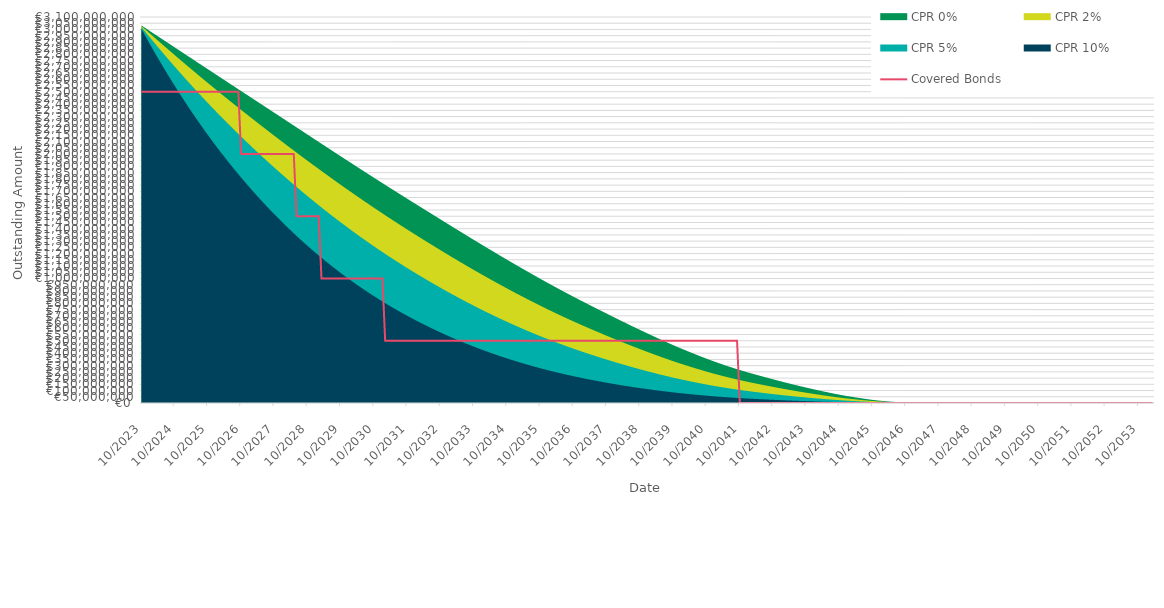
| Category | Covered Bonds |
|---|---|
| 2023-10-31 | 2500000000 |
| 2023-11-30 | 2500000000 |
| 2023-12-31 | 2500000000 |
| 2024-01-31 | 2500000000 |
| 2024-02-29 | 2500000000 |
| 2024-03-31 | 2500000000 |
| 2024-04-30 | 2500000000 |
| 2024-05-31 | 2500000000 |
| 2024-06-30 | 2500000000 |
| 2024-07-31 | 2500000000 |
| 2024-08-31 | 2500000000 |
| 2024-09-30 | 2500000000 |
| 2024-10-31 | 2500000000 |
| 2024-11-30 | 2500000000 |
| 2024-12-31 | 2500000000 |
| 2025-01-31 | 2500000000 |
| 2025-02-28 | 2500000000 |
| 2025-03-31 | 2500000000 |
| 2025-04-30 | 2500000000 |
| 2025-05-31 | 2500000000 |
| 2025-06-30 | 2500000000 |
| 2025-07-31 | 2500000000 |
| 2025-08-31 | 2500000000 |
| 2025-09-30 | 2500000000 |
| 2025-10-31 | 2500000000 |
| 2025-11-30 | 2500000000 |
| 2025-12-31 | 2500000000 |
| 2026-01-31 | 2500000000 |
| 2026-02-28 | 2500000000 |
| 2026-03-31 | 2500000000 |
| 2026-04-30 | 2500000000 |
| 2026-05-31 | 2500000000 |
| 2026-06-30 | 2500000000 |
| 2026-07-31 | 2500000000 |
| 2026-08-31 | 2500000000 |
| 2026-09-30 | 2500000000 |
| 2026-10-31 | 2000000000 |
| 2026-11-30 | 2000000000 |
| 2026-12-31 | 2000000000 |
| 2027-01-31 | 2000000000 |
| 2027-02-28 | 2000000000 |
| 2027-03-31 | 2000000000 |
| 2027-04-30 | 2000000000 |
| 2027-05-31 | 2000000000 |
| 2027-06-30 | 2000000000 |
| 2027-07-31 | 2000000000 |
| 2027-08-31 | 2000000000 |
| 2027-09-30 | 2000000000 |
| 2027-10-31 | 2000000000 |
| 2027-11-30 | 2000000000 |
| 2027-12-31 | 2000000000 |
| 2028-01-31 | 2000000000 |
| 2028-02-29 | 2000000000 |
| 2028-03-31 | 2000000000 |
| 2028-04-30 | 2000000000 |
| 2028-05-31 | 2000000000 |
| 2028-06-30 | 1500000000 |
| 2028-07-31 | 1500000000 |
| 2028-08-31 | 1500000000 |
| 2028-09-30 | 1500000000 |
| 2028-10-31 | 1500000000 |
| 2028-11-30 | 1500000000 |
| 2028-12-31 | 1500000000 |
| 2029-01-31 | 1500000000 |
| 2029-02-28 | 1500000000 |
| 2029-03-31 | 1000000000 |
| 2029-04-30 | 1000000000 |
| 2029-05-31 | 1000000000 |
| 2029-06-30 | 1000000000 |
| 2029-07-31 | 1000000000 |
| 2029-08-31 | 1000000000 |
| 2029-09-30 | 1000000000 |
| 2029-10-31 | 1000000000 |
| 2029-11-30 | 1000000000 |
| 2029-12-31 | 1000000000 |
| 2030-01-31 | 1000000000 |
| 2030-02-28 | 1000000000 |
| 2030-03-31 | 1000000000 |
| 2030-04-30 | 1000000000 |
| 2030-05-31 | 1000000000 |
| 2030-06-30 | 1000000000 |
| 2030-07-31 | 1000000000 |
| 2030-08-31 | 1000000000 |
| 2030-09-30 | 1000000000 |
| 2030-10-31 | 1000000000 |
| 2030-11-30 | 1000000000 |
| 2030-12-31 | 1000000000 |
| 2031-01-31 | 1000000000 |
| 2031-02-28 | 500000000 |
| 2031-03-31 | 500000000 |
| 2031-04-30 | 500000000 |
| 2031-05-31 | 500000000 |
| 2031-06-30 | 500000000 |
| 2031-07-31 | 500000000 |
| 2031-08-31 | 500000000 |
| 2031-09-30 | 500000000 |
| 2031-10-31 | 500000000 |
| 2031-11-30 | 500000000 |
| 2031-12-31 | 500000000 |
| 2032-01-31 | 500000000 |
| 2032-02-29 | 500000000 |
| 2032-03-31 | 500000000 |
| 2032-04-30 | 500000000 |
| 2032-05-31 | 500000000 |
| 2032-06-30 | 500000000 |
| 2032-07-31 | 500000000 |
| 2032-08-31 | 500000000 |
| 2032-09-30 | 500000000 |
| 2032-10-31 | 500000000 |
| 2032-11-30 | 500000000 |
| 2032-12-31 | 500000000 |
| 2033-01-31 | 500000000 |
| 2033-02-28 | 500000000 |
| 2033-03-31 | 500000000 |
| 2033-04-30 | 500000000 |
| 2033-05-31 | 500000000 |
| 2033-06-30 | 500000000 |
| 2033-07-31 | 500000000 |
| 2033-08-31 | 500000000 |
| 2033-09-30 | 500000000 |
| 2033-10-31 | 500000000 |
| 2033-11-30 | 500000000 |
| 2033-12-31 | 500000000 |
| 2034-01-31 | 500000000 |
| 2034-02-28 | 500000000 |
| 2034-03-31 | 500000000 |
| 2034-04-30 | 500000000 |
| 2034-05-31 | 500000000 |
| 2034-06-30 | 500000000 |
| 2034-07-31 | 500000000 |
| 2034-08-31 | 500000000 |
| 2034-09-30 | 500000000 |
| 2034-10-31 | 500000000 |
| 2034-11-30 | 500000000 |
| 2034-12-31 | 500000000 |
| 2035-01-31 | 500000000 |
| 2035-02-28 | 500000000 |
| 2035-03-31 | 500000000 |
| 2035-04-30 | 500000000 |
| 2035-05-31 | 500000000 |
| 2035-06-30 | 500000000 |
| 2035-07-31 | 500000000 |
| 2035-08-31 | 500000000 |
| 2035-09-30 | 500000000 |
| 2035-10-31 | 500000000 |
| 2035-11-30 | 500000000 |
| 2035-12-31 | 500000000 |
| 2036-01-31 | 500000000 |
| 2036-02-29 | 500000000 |
| 2036-03-31 | 500000000 |
| 2036-04-30 | 500000000 |
| 2036-05-31 | 500000000 |
| 2036-06-30 | 500000000 |
| 2036-07-31 | 500000000 |
| 2036-08-31 | 500000000 |
| 2036-09-30 | 500000000 |
| 2036-10-31 | 500000000 |
| 2036-11-30 | 500000000 |
| 2036-12-31 | 500000000 |
| 2037-01-31 | 500000000 |
| 2037-02-28 | 500000000 |
| 2037-03-31 | 500000000 |
| 2037-04-30 | 500000000 |
| 2037-05-31 | 500000000 |
| 2037-06-30 | 500000000 |
| 2037-07-31 | 500000000 |
| 2037-08-31 | 500000000 |
| 2037-09-30 | 500000000 |
| 2037-10-31 | 500000000 |
| 2037-11-30 | 500000000 |
| 2037-12-31 | 500000000 |
| 2038-01-31 | 500000000 |
| 2038-02-28 | 500000000 |
| 2038-03-31 | 500000000 |
| 2038-04-30 | 500000000 |
| 2038-05-31 | 500000000 |
| 2038-06-30 | 500000000 |
| 2038-07-31 | 500000000 |
| 2038-08-31 | 500000000 |
| 2038-09-30 | 500000000 |
| 2038-10-31 | 500000000 |
| 2038-11-30 | 500000000 |
| 2038-12-31 | 500000000 |
| 2039-01-31 | 500000000 |
| 2039-02-28 | 500000000 |
| 2039-03-31 | 500000000 |
| 2039-04-30 | 500000000 |
| 2039-05-31 | 500000000 |
| 2039-06-30 | 500000000 |
| 2039-07-31 | 500000000 |
| 2039-08-31 | 500000000 |
| 2039-09-30 | 500000000 |
| 2039-10-31 | 500000000 |
| 2039-11-30 | 500000000 |
| 2039-12-31 | 500000000 |
| 2040-01-31 | 500000000 |
| 2040-02-29 | 500000000 |
| 2040-03-31 | 500000000 |
| 2040-04-30 | 500000000 |
| 2040-05-31 | 500000000 |
| 2040-06-30 | 500000000 |
| 2040-07-31 | 500000000 |
| 2040-08-31 | 500000000 |
| 2040-09-30 | 500000000 |
| 2040-10-31 | 500000000 |
| 2040-11-30 | 500000000 |
| 2040-12-31 | 500000000 |
| 2041-01-31 | 500000000 |
| 2041-02-28 | 500000000 |
| 2041-03-31 | 500000000 |
| 2041-04-30 | 500000000 |
| 2041-05-31 | 500000000 |
| 2041-06-30 | 500000000 |
| 2041-07-31 | 500000000 |
| 2041-08-31 | 500000000 |
| 2041-09-30 | 500000000 |
| 2041-10-31 | 0 |
| 2041-11-30 | 0 |
| 2041-12-31 | 0 |
| 2042-01-31 | 0 |
| 2042-02-28 | 0 |
| 2042-03-31 | 0 |
| 2042-04-30 | 0 |
| 2042-05-31 | 0 |
| 2042-06-30 | 0 |
| 2042-07-31 | 0 |
| 2042-08-31 | 0 |
| 2042-09-30 | 0 |
| 2042-10-31 | 0 |
| 2042-11-30 | 0 |
| 2042-12-31 | 0 |
| 2043-01-31 | 0 |
| 2043-02-28 | 0 |
| 2043-03-31 | 0 |
| 2043-04-30 | 0 |
| 2043-05-31 | 0 |
| 2043-06-30 | 0 |
| 2043-07-31 | 0 |
| 2043-08-31 | 0 |
| 2043-09-30 | 0 |
| 2043-10-31 | 0 |
| 2043-11-30 | 0 |
| 2043-12-31 | 0 |
| 2044-01-31 | 0 |
| 2044-02-29 | 0 |
| 2044-03-31 | 0 |
| 2044-04-30 | 0 |
| 2044-05-31 | 0 |
| 2044-06-30 | 0 |
| 2044-07-31 | 0 |
| 2044-08-31 | 0 |
| 2044-09-30 | 0 |
| 2044-10-31 | 0 |
| 2044-11-30 | 0 |
| 2044-12-31 | 0 |
| 2045-01-31 | 0 |
| 2045-02-28 | 0 |
| 2045-03-31 | 0 |
| 2045-04-30 | 0 |
| 2045-05-31 | 0 |
| 2045-06-30 | 0 |
| 2045-07-31 | 0 |
| 2045-08-31 | 0 |
| 2045-09-30 | 0 |
| 2045-10-31 | 0 |
| 2045-11-30 | 0 |
| 2045-12-31 | 0 |
| 2046-01-31 | 0 |
| 2046-02-28 | 0 |
| 2046-03-31 | 0 |
| 2046-04-30 | 0 |
| 2046-05-31 | 0 |
| 2046-06-30 | 0 |
| 2046-07-31 | 0 |
| 2046-08-31 | 0 |
| 2046-09-30 | 0 |
| 2046-10-31 | 0 |
| 2046-11-30 | 0 |
| 2046-12-31 | 0 |
| 2047-01-31 | 0 |
| 2047-02-28 | 0 |
| 2047-03-31 | 0 |
| 2047-04-30 | 0 |
| 2047-05-31 | 0 |
| 2047-06-30 | 0 |
| 2047-07-31 | 0 |
| 2047-08-31 | 0 |
| 2047-09-30 | 0 |
| 2047-10-31 | 0 |
| 2047-11-30 | 0 |
| 2047-12-31 | 0 |
| 2048-01-31 | 0 |
| 2048-02-29 | 0 |
| 2048-03-31 | 0 |
| 2048-04-30 | 0 |
| 2048-05-31 | 0 |
| 2048-06-30 | 0 |
| 2048-07-31 | 0 |
| 2048-08-31 | 0 |
| 2048-09-30 | 0 |
| 2048-10-31 | 0 |
| 2048-11-30 | 0 |
| 2048-12-31 | 0 |
| 2049-01-31 | 0 |
| 2049-02-28 | 0 |
| 2049-03-31 | 0 |
| 2049-04-30 | 0 |
| 2049-05-31 | 0 |
| 2049-06-30 | 0 |
| 2049-07-31 | 0 |
| 2049-08-31 | 0 |
| 2049-09-30 | 0 |
| 2049-10-31 | 0 |
| 2049-11-30 | 0 |
| 2049-12-31 | 0 |
| 2050-01-31 | 0 |
| 2050-02-28 | 0 |
| 2050-03-31 | 0 |
| 2050-04-30 | 0 |
| 2050-05-31 | 0 |
| 2050-06-30 | 0 |
| 2050-07-31 | 0 |
| 2050-08-31 | 0 |
| 2050-09-30 | 0 |
| 2050-10-31 | 0 |
| 2050-11-30 | 0 |
| 2050-12-31 | 0 |
| 2051-01-31 | 0 |
| 2051-02-28 | 0 |
| 2051-03-31 | 0 |
| 2051-04-30 | 0 |
| 2051-05-31 | 0 |
| 2051-06-30 | 0 |
| 2051-07-31 | 0 |
| 2051-08-31 | 0 |
| 2051-09-30 | 0 |
| 2051-10-31 | 0 |
| 2051-11-30 | 0 |
| 2051-12-31 | 0 |
| 2052-01-31 | 0 |
| 2052-02-29 | 0 |
| 2052-03-31 | 0 |
| 2052-04-30 | 0 |
| 2052-05-31 | 0 |
| 2052-06-30 | 0 |
| 2052-07-31 | 0 |
| 2052-08-31 | 0 |
| 2052-09-30 | 0 |
| 2052-10-31 | 0 |
| 2052-11-30 | 0 |
| 2052-12-31 | 0 |
| 2053-01-31 | 0 |
| 2053-02-28 | 0 |
| 2053-03-31 | 0 |
| 2053-04-30 | 0 |
| 2053-05-31 | 0 |
| 2053-06-30 | 0 |
| 2053-07-31 | 0 |
| 2053-08-31 | 0 |
| 2053-09-30 | 0 |
| 2053-10-31 | 0 |
| 2053-11-30 | 0 |
| 2053-12-31 | 0 |
| 2054-01-31 | 0 |
| 2054-02-28 | 0 |
| 2054-03-31 | 0 |